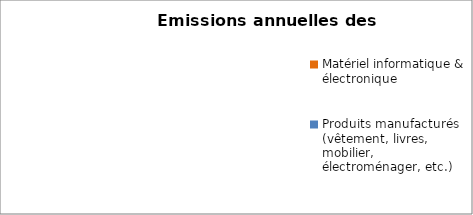
| Category | kg eq C |
|---|---|
| Matériel informatique & électronique  | 0 |
| Produits manufacturés (vêtement, livres, mobilier, électroménager, etc.) | 0 |